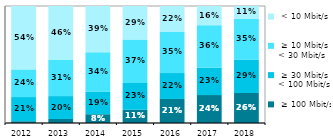
| Category |  ≥ 100 Mbit/s  |  ≥ 30 Mbit/s < 100 Mbit/s |  ≥ 10 Mbit/s < 30 Mbit/s |  < 10 Mbit/s  |
|---|---|---|---|---|
| 2012.0 | 0.015 | 0.207 | 0.237 | 0.542 |
| 2013.0 | 0.034 | 0.195 | 0.309 | 0.462 |
| 2014.0 | 0.075 | 0.193 | 0.338 | 0.394 |
| 2015.0 | 0.113 | 0.229 | 0.371 | 0.286 |
| 2016.0 | 0.206 | 0.221 | 0.352 | 0.221 |
| 2017.0 | 0.239 | 0.233 | 0.364 | 0.164 |
| 2018.0 | 0.256 | 0.285 | 0.348 | 0.11 |